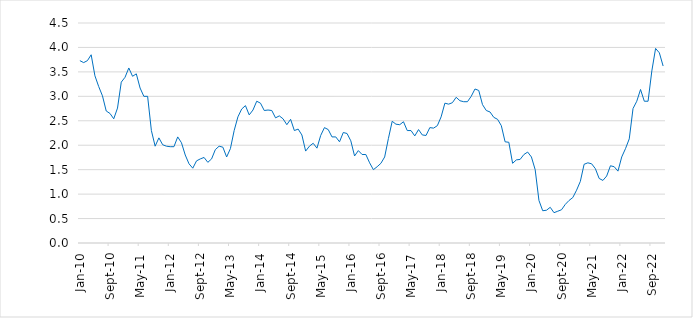
| Category | Series 0 |
|---|---|
| 2010-01-01 | 3.73 |
| 2010-02-01 | 3.69 |
| 2010-03-01 | 3.73 |
| 2010-04-01 | 3.85 |
| 2010-05-01 | 3.42 |
| 2010-06-01 | 3.2 |
| 2010-07-01 | 3.01 |
| 2010-08-01 | 2.7 |
| 2010-09-01 | 2.65 |
| 2010-10-01 | 2.54 |
| 2010-11-01 | 2.76 |
| 2010-12-01 | 3.29 |
| 2011-01-01 | 3.39 |
| 2011-02-01 | 3.58 |
| 2011-03-01 | 3.41 |
| 2011-04-01 | 3.46 |
| 2011-05-01 | 3.17 |
| 2011-06-01 | 3 |
| 2011-07-01 | 3 |
| 2011-08-01 | 2.3 |
| 2011-09-01 | 1.98 |
| 2011-10-01 | 2.15 |
| 2011-11-01 | 2.01 |
| 2011-12-01 | 1.98 |
| 2012-01-01 | 1.97 |
| 2012-02-01 | 1.97 |
| 2012-03-01 | 2.17 |
| 2012-04-01 | 2.05 |
| 2012-05-01 | 1.8 |
| 2012-06-01 | 1.62 |
| 2012-07-01 | 1.53 |
| 2012-08-01 | 1.68 |
| 2012-09-01 | 1.72 |
| 2012-10-01 | 1.75 |
| 2012-11-01 | 1.65 |
| 2012-12-01 | 1.72 |
| 2013-01-01 | 1.91 |
| 2013-02-01 | 1.98 |
| 2013-03-01 | 1.96 |
| 2013-04-01 | 1.76 |
| 2013-05-01 | 1.93 |
| 2013-06-01 | 2.3 |
| 2013-07-01 | 2.58 |
| 2013-08-01 | 2.74 |
| 2013-09-01 | 2.81 |
| 2013-10-01 | 2.62 |
| 2013-11-01 | 2.72 |
| 2013-12-01 | 2.9 |
| 2014-01-01 | 2.86 |
| 2014-02-01 | 2.71 |
| 2014-03-01 | 2.72 |
| 2014-04-01 | 2.71 |
| 2014-05-01 | 2.56 |
| 2014-06-01 | 2.6 |
| 2014-07-01 | 2.54 |
| 2014-08-01 | 2.42 |
| 2014-09-01 | 2.53 |
| 2014-10-01 | 2.3 |
| 2014-11-01 | 2.33 |
| 2014-12-01 | 2.21 |
| 2015-01-01 | 1.88 |
| 2015-02-01 | 1.98 |
| 2015-03-01 | 2.04 |
| 2015-04-01 | 1.94 |
| 2015-05-01 | 2.2 |
| 2015-06-01 | 2.36 |
| 2015-07-01 | 2.32 |
| 2015-08-01 | 2.17 |
| 2015-09-01 | 2.17 |
| 2015-10-01 | 2.07 |
| 2015-11-01 | 2.26 |
| 2015-12-01 | 2.24 |
| 2016-01-01 | 2.09 |
| 2016-02-01 | 1.78 |
| 2016-03-01 | 1.89 |
| 2016-04-01 | 1.81 |
| 2016-05-01 | 1.81 |
| 2016-06-01 | 1.64 |
| 2016-07-01 | 1.5 |
| 2016-08-01 | 1.56 |
| 2016-09-01 | 1.63 |
| 2016-10-01 | 1.76 |
| 2016-11-01 | 2.14 |
| 2016-12-01 | 2.49 |
| 2017-01-01 | 2.43 |
| 2017-02-01 | 2.42 |
| 2017-03-01 | 2.48 |
| 2017-04-01 | 2.3 |
| 2017-05-01 | 2.3 |
| 2017-06-01 | 2.19 |
| 2017-07-01 | 2.32 |
| 2017-08-01 | 2.21 |
| 2017-09-01 | 2.2 |
| 2017-10-01 | 2.36 |
| 2017-11-01 | 2.35 |
| 2017-12-01 | 2.4 |
| 2018-01-01 | 2.58 |
| 2018-02-01 | 2.86 |
| 2018-03-01 | 2.84 |
| 2018-04-01 | 2.87 |
| 2018-05-01 | 2.98 |
| 2018-06-01 | 2.91 |
| 2018-07-01 | 2.89 |
| 2018-08-01 | 2.89 |
| 2018-09-01 | 3 |
| 2018-10-01 | 3.15 |
| 2018-11-01 | 3.12 |
| 2018-12-01 | 2.83 |
| 2019-01-01 | 2.71 |
| 2019-02-01 | 2.68 |
| 2019-03-01 | 2.57 |
| 2019-04-01 | 2.53 |
| 2019-05-01 | 2.4 |
| 2019-06-01 | 2.07 |
| 2019-07-01 | 2.06 |
| 2019-08-01 | 1.63 |
| 2019-09-01 | 1.7 |
| 2019-10-01 | 1.71 |
| 2019-11-01 | 1.81 |
| 2019-12-01 | 1.86 |
| 2020-01-01 | 1.76 |
| 2020-02-01 | 1.5 |
| 2020-03-01 | 0.87 |
| 2020-04-01 | 0.66 |
| 2020-05-01 | 0.67 |
| 2020-06-01 | 0.73 |
| 2020-07-01 | 0.62 |
| 2020-08-01 | 0.65 |
| 2020-09-01 | 0.68 |
| 2020-10-01 | 0.79 |
| 2020-11-01 | 0.87 |
| 2020-12-01 | 0.93 |
| 2021-01-01 | 1.08 |
| 2021-02-01 | 1.26 |
| 2021-03-01 | 1.61 |
| 2021-04-01 | 1.64 |
| 2021-05-01 | 1.62 |
| 2021-06-01 | 1.52 |
| 2021-07-01 | 1.32 |
| 2021-08-01 | 1.28 |
| 2021-09-01 | 1.37 |
| 2021-10-01 | 1.58 |
| 2021-11-01 | 1.56 |
| 2021-12-01 | 1.47 |
| 2022-01-01 | 1.76 |
| 2022-02-01 | 1.93 |
| 2022-03-01 | 2.13 |
| 2022-04-01 | 2.75 |
| 2022-05-01 | 2.9 |
| 2022-06-01 | 3.14 |
| 2022-07-01 | 2.9 |
| 2022-08-01 | 2.9 |
| 2022-09-01 | 3.52 |
| 2022-10-01 | 3.98 |
| 2022-11-01 | 3.89 |
| 2022-12-01 | 3.62 |